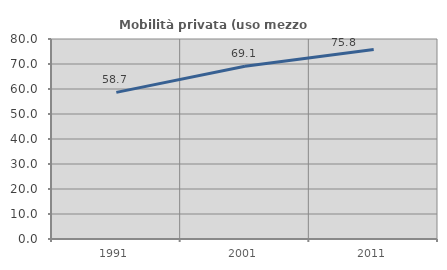
| Category | Mobilità privata (uso mezzo privato) |
|---|---|
| 1991.0 | 58.652 |
| 2001.0 | 69.071 |
| 2011.0 | 75.76 |